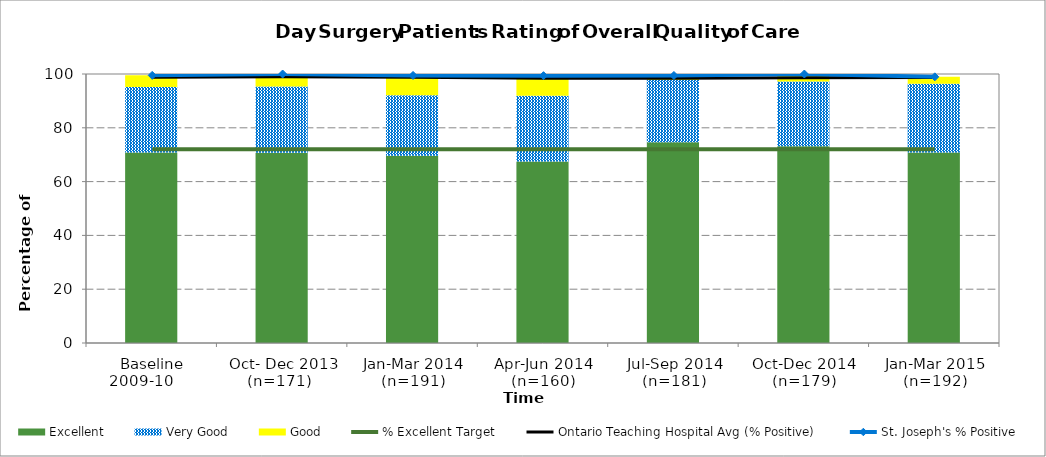
| Category | Excellent | Very Good | Good |
|---|---|---|---|
| Baseline 2009-10      | 70.78 | 24.42 | 4.29 |
| Oct- Dec 2013 (n=171)   | 70.76 | 24.56 | 4.68 |
| Jan-Mar 2014 (n=191) | 69.63 | 22.51 | 7.33 |
| Apr-Jun 2014 (n=160) | 67.5 | 24.38 | 7.5 |
| Jul-Sep 2014 (n=181) | 74.59 | 23.2 | 1.66 |
| Oct-Dec 2014 (n=179) | 73.18 | 24.02 | 2.79 |
| Jan-Mar 2015 (n=192) | 70.83 | 25.52 | 2.6 |